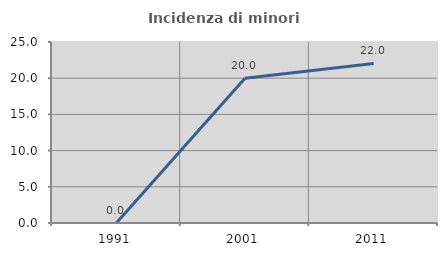
| Category | Incidenza di minori stranieri |
|---|---|
| 1991.0 | 0 |
| 2001.0 | 20 |
| 2011.0 | 22.034 |